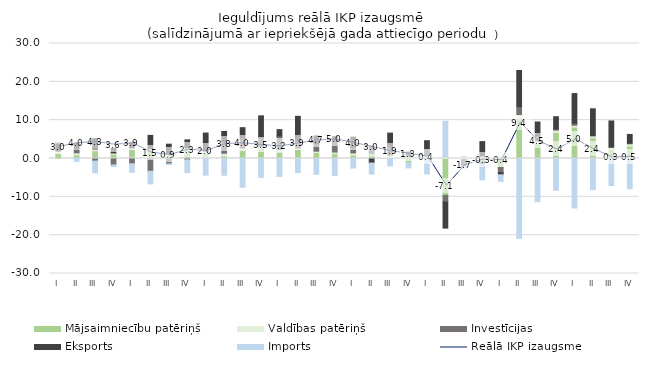
| Category | Mājsaimniecību patēriņš | Valdības patēriņš | Investīcijas | Eksports | Imports |
|---|---|---|---|---|---|
| I | 1.376 | 0.594 | 0.023 | 2.08 | 0.011 |
| II | 0.929 | 0.546 | 1.115 | 1.377 | -0.742 |
| III | 2.003 | 0.498 | -0.669 | 2.701 | -3.08 |
| IV | 1.069 | 0.364 | -1.672 | 1.17 | -0.422 |
| I | 2.433 | 0.323 | -1.384 | 1.456 | -2.215 |
| II | 2.201 | 0.311 | -3.327 | 3.525 | -3.309 |
| III | 0.938 | 0.375 | -1.386 | 2.422 | -0.192 |
| IV | 2.218 | 0.535 | -0.371 | 2.111 | -3.324 |
| I | 1.283 | 0.593 | 0.29 | 4.48 | -4.351 |
| II | 0.677 | 0.678 | 2.958 | 2.747 | -4.357 |
| III | 2.054 | 0.653 | 2.687 | 2.649 | -7.494 |
| IV | 2.595 | 0.538 | 2.383 | 5.614 | -4.909 |
| I | 1.889 | 0.428 | 3.536 | 1.682 | -4.675 |
| II | 2.346 | 0.333 | 1.917 | 6.406 | -3.676 |
| III | 1.575 | 0.334 | 1.947 | 2.036 | -4.123 |
| IV | 1.255 | 0.428 | 3.021 | 0.966 | -4.416 |
| I | 0.876 | 0.582 | 1.476 | 2.65 | -2.496 |
| II | 0.634 | 0.659 | 2.017 | -1.189 | -2.891 |
| III | 0.193 | 0.631 | 2.218 | 3.581 | -1.931 |
| IV | -1.091 | 0.587 | 0.739 | 0.327 | -1.358 |
| I | 0.316 | 0.471 | 1.714 | 2.146 | -4.021 |
| II | -9.642 | 0.418 | -1.727 | -6.786 | 9.3 |
| III | -0.212 | 0.567 | -1.53 | -0.243 | -0.552 |
| IV | -1.01 | 0.626 | -0.458 | 3.783 | -4.1 |
| I | -2.35 | 0.773 | -1.329 | -0.583 | -1.711 |
| II | 10.479 | 0.917 | 2.125 | 9.435 | -20.839 |
| III | 3.855 | 0.732 | 1.343 | 3.59 | -11.294 |
| IV | 6.803 | 0.604 | 0.292 | 3.202 | -8.28 |
| I | 8.18 | 0.49 | 0.532 | 7.737 | -12.925 |
| II | 5.416 | 0.457 | 0.129 | 6.966 | -8.126 |
| III | 2.411 | 0.514 | -0.018 | 6.868 | -7.027 |
| IV | 3.206 | 0.62 | 0.162 | 2.291 | -7.876 |